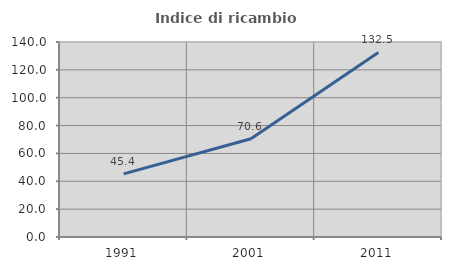
| Category | Indice di ricambio occupazionale  |
|---|---|
| 1991.0 | 45.355 |
| 2001.0 | 70.579 |
| 2011.0 | 132.496 |